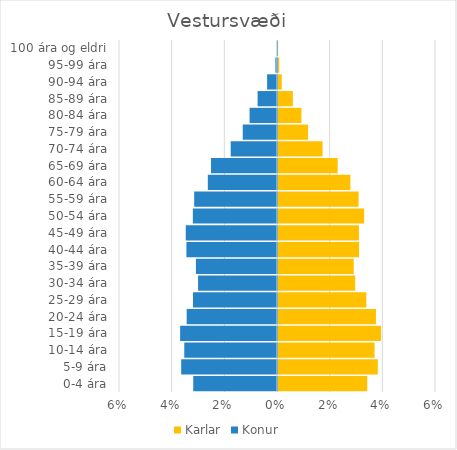
| Category | Karlar | Konur |
|---|---|---|
| 0-4 ára | 0.034 | -0.032 |
| 5-9 ára | 0.038 | -0.036 |
| 10-14 ára | 0.037 | -0.035 |
| 15-19 ára | 0.039 | -0.037 |
| 20-24 ára | 0.037 | -0.034 |
| 25-29 ára | 0.034 | -0.032 |
| 30-34 ára | 0.029 | -0.03 |
| 35-39 ára | 0.029 | -0.031 |
| 40-44 ára | 0.031 | -0.034 |
| 45-49 ára | 0.031 | -0.035 |
| 50-54 ára | 0.033 | -0.032 |
| 55-59 ára | 0.031 | -0.031 |
| 60-64 ára | 0.027 | -0.026 |
| 65-69 ára | 0.023 | -0.025 |
| 70-74 ára | 0.017 | -0.018 |
| 75-79 ára | 0.011 | -0.013 |
| 80-84 ára | 0.009 | -0.01 |
| 85-89 ára | 0.006 | -0.007 |
| 90-94 ára | 0.001 | -0.004 |
| 95-99 ára | 0 | -0.001 |
| 100 ára og eldri | 0 | 0 |